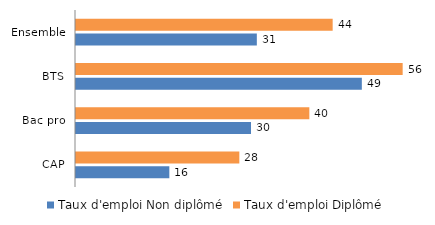
| Category | Taux d'emploi |
|---|---|
| CAP | 28 |
| Bac pro | 40 |
| BTS | 56 |
| Ensemble | 44 |